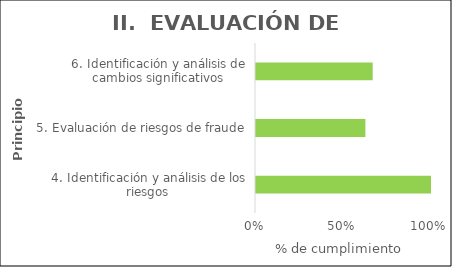
| Category | Principios |
|---|---|
| 4. Identificación y análisis de los riesgos | 1 |
| 5. Evaluación de riesgos de fraude | 0.625 |
| 6. Identificación y análisis de cambios significativos | 0.667 |